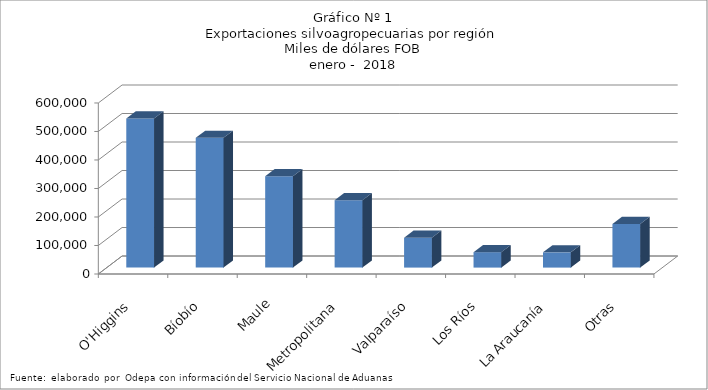
| Category | Series 0 |
|---|---|
| O'Higgins | 523464.926 |
| Bíobío | 455136.842 |
| Maule | 320633.665 |
| Metropolitana | 236133.2 |
| Valparaíso | 104599.442 |
| Los Ríos | 54090.792 |
| La Araucanía | 53421.193 |
| Otras | 153276.531 |